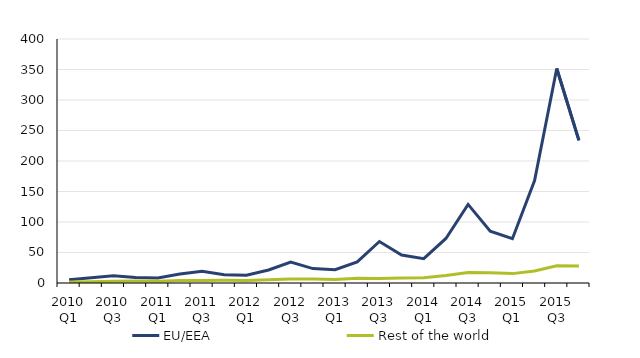
| Category | EU/EEA | Rest of the world |
|---|---|---|
| 2010 Q1 | 5.277 | 1.501 |
| 2010 Q2 | 8.7 | 2.034 |
| 2010 Q3 | 12.005 | 2.825 |
| 2010 Q4 | 8.857 | 3.207 |
| 2011 Q1 | 8.354 | 3.02 |
| 2011 Q2 | 14.612 | 3.918 |
| 2011 Q3 | 19.162 | 3.895 |
| 2011 Q4 | 13.635 | 4.366 |
| 2012 Q1 | 12.588 | 4.086 |
| 2012 Q2 | 21.3 | 5.134 |
| 2012 Q3 | 34.327 | 6.403 |
| 2012 Q4 | 23.663 | 6.488 |
| 2013 Q1 | 21.88 | 5.777 |
| 2013 Q2 | 34.532 | 7.657 |
| 2013 Q3 | 68.012 | 7.409 |
| 2013 Q4 | 45.829 | 8.147 |
| 2014 Q1 | 39.851 | 8.548 |
| 2014 Q2 | 73.005 | 12.315 |
| 2014 Q3 | 128.849 | 17.039 |
| 2014 Q4 | 85.07 | 16.834 |
| 2015 Q1 | 72.621 | 15.382 |
| 2015 Q2 | 168.039 | 19.807 |
| 2015 Q3 | 351.689 | 28.28 |
| 2015 Q4 | 233.804 | 27.83 |